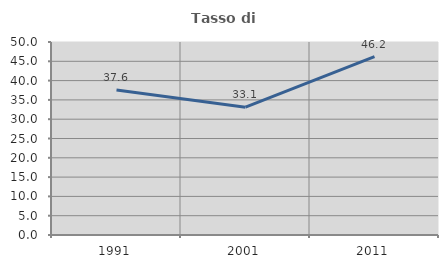
| Category | Tasso di occupazione   |
|---|---|
| 1991.0 | 37.572 |
| 2001.0 | 33.11 |
| 2011.0 | 46.209 |